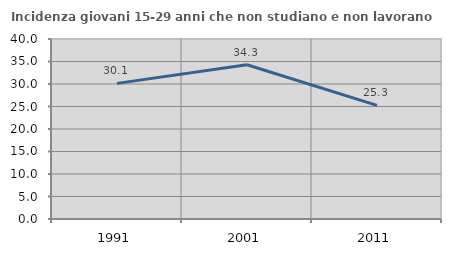
| Category | Incidenza giovani 15-29 anni che non studiano e non lavorano  |
|---|---|
| 1991.0 | 30.138 |
| 2001.0 | 34.275 |
| 2011.0 | 25.253 |